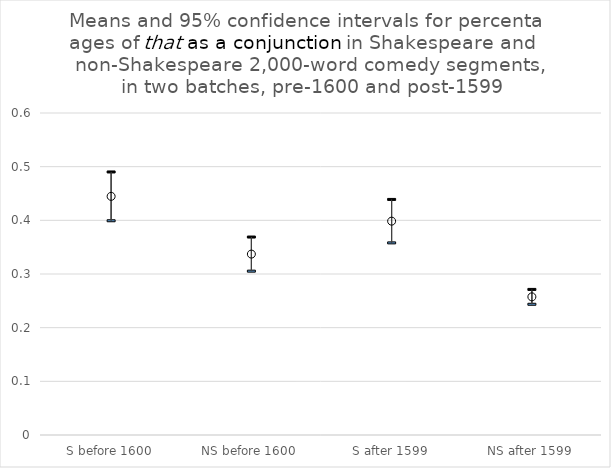
| Category | lower CL | upper CL | mean |
|---|---|---|---|
| S before 1600 | 0.399 | 0.49 | 0.445 |
| NS before 1600 | 0.305 | 0.369 | 0.337 |
| S after 1599 | 0.358 | 0.439 | 0.398 |
| NS after 1599 | 0.244 | 0.271 | 0.257 |